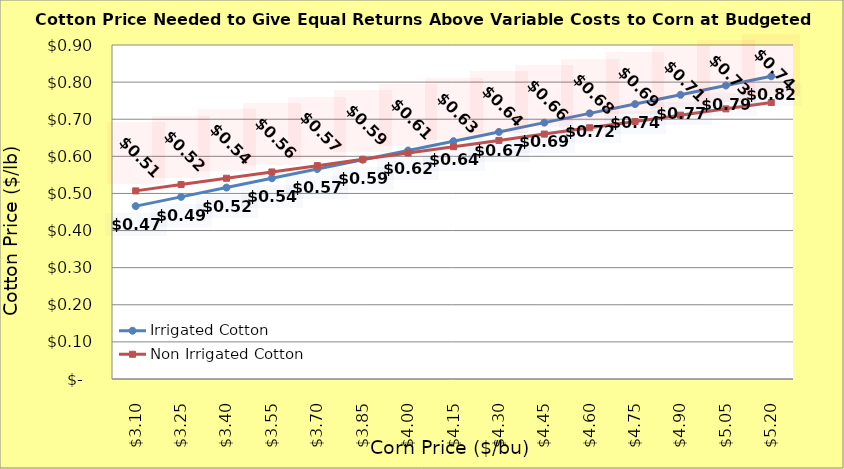
| Category | Irrigated Cotton | Non Irrigated Cotton |
|---|---|---|
| 3.1000000000000005 | 0.466 | 0.507 |
| 3.2500000000000004 | 0.491 | 0.524 |
| 3.4000000000000004 | 0.516 | 0.541 |
| 3.5500000000000003 | 0.541 | 0.558 |
| 3.7 | 0.566 | 0.575 |
| 3.85 | 0.591 | 0.592 |
| 4.0 | 0.616 | 0.609 |
| 4.15 | 0.641 | 0.626 |
| 4.300000000000001 | 0.666 | 0.643 |
| 4.450000000000001 | 0.691 | 0.66 |
| 4.600000000000001 | 0.716 | 0.677 |
| 4.750000000000002 | 0.741 | 0.694 |
| 4.900000000000002 | 0.766 | 0.711 |
| 5.0500000000000025 | 0.791 | 0.728 |
| 5.200000000000003 | 0.816 | 0.745 |